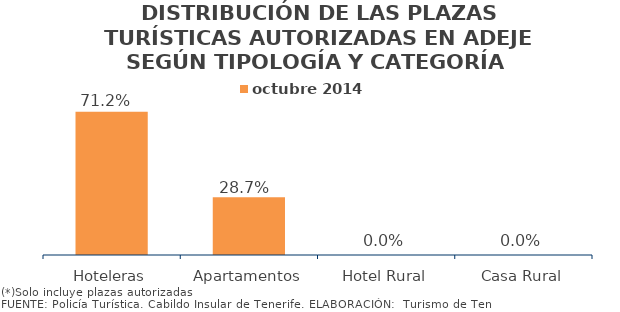
| Category | octubre 2014 |
|---|---|
| Hoteleras | 0.712 |
| Apartamentos | 0.287 |
| Hotel Rural | 0 |
| Casa Rural | 0 |